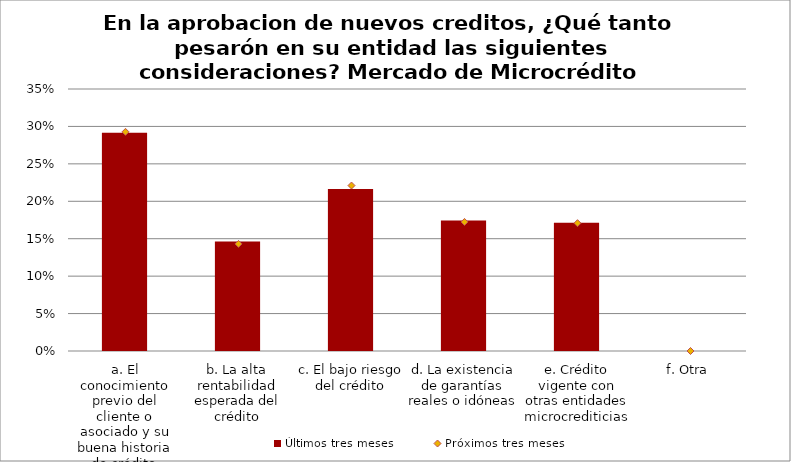
| Category | Últimos tres meses |
|---|---|
| a. El conocimiento previo del cliente o asociado y su buena historia de crédito | 0.292 |
| b. La alta rentabilidad esperada del crédito | 0.146 |
| c. El bajo riesgo del crédito | 0.216 |
| d. La existencia de garantías reales o idóneas | 0.174 |
| e. Crédito vigente con otras entidades microcrediticias | 0.171 |
| f. Otra | 0 |